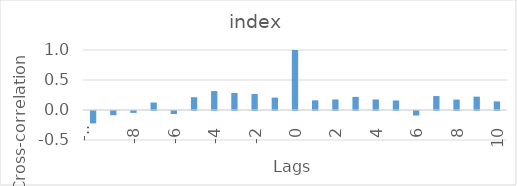
| Category | index |
|---|---|
| -10.0 | -0.207 |
| -9.0 | -0.07 |
| -8.0 | -0.032 |
| -7.0 | 0.124 |
| -6.0 | -0.05 |
| -5.0 | 0.213 |
| -4.0 | 0.316 |
| -3.0 | 0.284 |
| -2.0 | 0.267 |
| -1.0 | 0.206 |
| 0.0 | 1 |
| 1.0 | 0.161 |
| 2.0 | 0.176 |
| 3.0 | 0.219 |
| 4.0 | 0.175 |
| 5.0 | 0.159 |
| 6.0 | -0.076 |
| 7.0 | 0.233 |
| 8.0 | 0.174 |
| 9.0 | 0.222 |
| 10.0 | 0.143 |